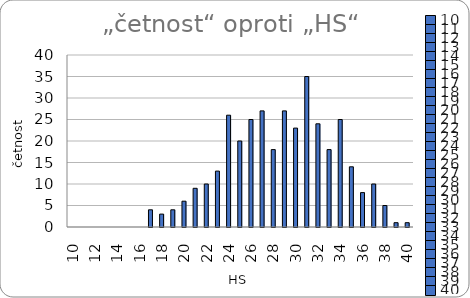
| Category | četnost |
|---|---|
| 10.0 | 0 |
| 11.0 | 0 |
| 12.0 | 0 |
| 13.0 | 0 |
| 14.0 | 0 |
| 15.0 | 0 |
| 16.0 | 0 |
| 17.0 | 4 |
| 18.0 | 3 |
| 19.0 | 4 |
| 20.0 | 6 |
| 21.0 | 9 |
| 22.0 | 10 |
| 23.0 | 13 |
| 24.0 | 26 |
| 25.0 | 20 |
| 26.0 | 25 |
| 27.0 | 27 |
| 28.0 | 18 |
| 29.0 | 27 |
| 30.0 | 23 |
| 31.0 | 35 |
| 32.0 | 24 |
| 33.0 | 18 |
| 34.0 | 25 |
| 35.0 | 14 |
| 36.0 | 8 |
| 37.0 | 10 |
| 38.0 | 5 |
| 39.0 | 1 |
| 40.0 | 1 |